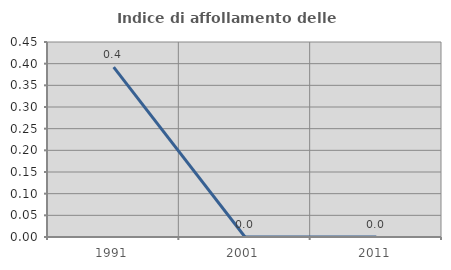
| Category | Indice di affollamento delle abitazioni  |
|---|---|
| 1991.0 | 0.392 |
| 2001.0 | 0 |
| 2011.0 | 0 |